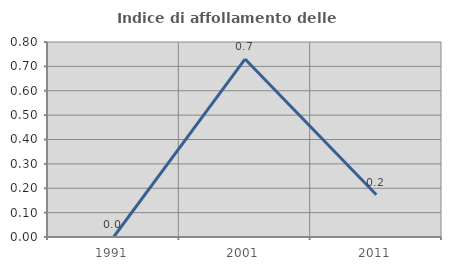
| Category | Indice di affollamento delle abitazioni  |
|---|---|
| 1991.0 | 0 |
| 2001.0 | 0.73 |
| 2011.0 | 0.173 |